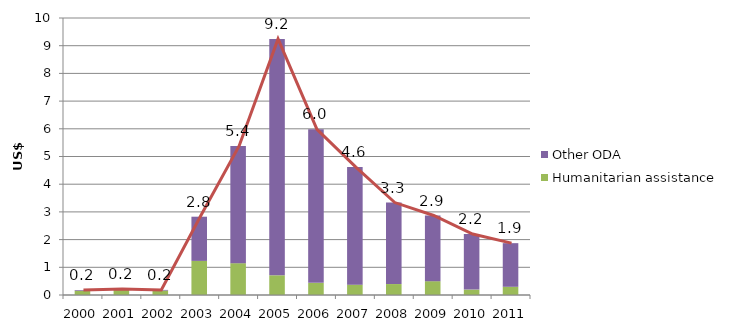
| Category | Humanitarian assistance | Other ODA |
|---|---|---|
| 2000.0 | 0.153 | 0.025 |
| 2001.0 | 0.187 | 0.03 |
| 2002.0 | 0.161 | 0.022 |
| 2003.0 | 1.231 | 1.595 |
| 2004.0 | 1.149 | 4.231 |
| 2005.0 | 0.711 | 8.534 |
| 2006.0 | 0.438 | 5.542 |
| 2007.0 | 0.375 | 4.244 |
| 2008.0 | 0.395 | 2.942 |
| 2009.0 | 0.499 | 2.371 |
| 2010.0 | 0.196 | 2.004 |
| 2011.0 | 0.296 | 1.575 |